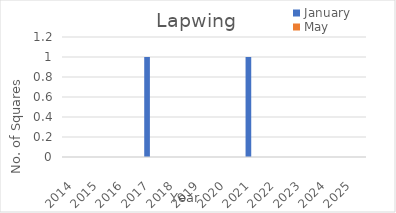
| Category | January | May |
|---|---|---|
| 2014.0 | 0 | 0 |
| 2015.0 | 0 | 0 |
| 2016.0 | 0 | 0 |
| 2017.0 | 1 | 0 |
| 2018.0 | 0 | 0 |
| 2019.0 | 0 | 0 |
| 2020.0 | 0 | 0 |
| 2021.0 | 1 | 0 |
| 2022.0 | 0 | 0 |
| 2023.0 | 0 | 0 |
| 2024.0 | 0 | 0 |
| 2025.0 | 0 | 0 |